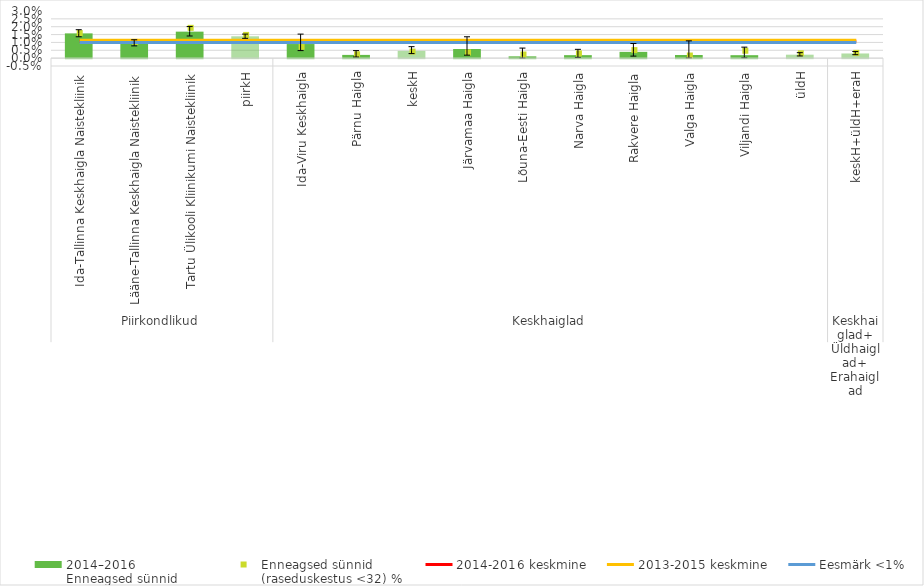
| Category | 2014–2016
Enneagsed sünnid
(raseduskestus <32) % |
|---|---|
| 0 | 0.016 |
| 1 | 0.01 |
| 2 | 0.017 |
| 3 | 0.014 |
| 4 | 0.009 |
| 5 | 0.002 |
| 6 | 0.005 |
| 7 | 0.006 |
| 8 | 0.001 |
| 9 | 0.002 |
| 10 | 0.004 |
| 11 | 0.002 |
| 12 | 0.002 |
| 13 | 0.002 |
| 14 | 0.003 |